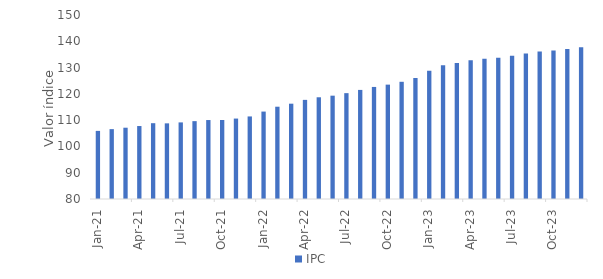
| Category | IPC |
|---|---|
| 2021-01-01 | 105.91 |
| 2021-02-01 | 106.58 |
| 2021-03-01 | 107.12 |
| 2021-04-01 | 107.76 |
| 2021-05-01 | 108.84 |
| 2021-06-01 | 108.78 |
| 2021-07-01 | 109.14 |
| 2021-08-01 | 109.62 |
| 2021-09-01 | 110.04 |
| 2021-10-01 | 110.06 |
| 2021-11-01 | 110.6 |
| 2021-12-01 | 111.41 |
| 2022-01-01 | 113.26 |
| 2022-02-01 | 115.11 |
| 2022-03-01 | 116.26 |
| 2022-04-01 | 117.71 |
| 2022-05-01 | 118.7 |
| 2022-06-01 | 119.31 |
| 2022-07-01 | 120.27 |
| 2022-08-01 | 121.5 |
| 2022-09-01 | 122.63 |
| 2022-10-01 | 123.51 |
| 2022-11-01 | 124.59 |
| 2022-12-01 | 126.03 |
| 2023-01-01 | 128.76 |
| 2023-02-01 | 130.87 |
| 2023-03-01 | 131.77 |
| 2023-04-01 | 132.8 |
| 2023-05-01 | 133.38 |
| 2023-06-01 | 133.78 |
| 2023-07-01 | 134.45 |
| 2023-08-01 | 135.39 |
| 2023-09-01 | 136.11 |
| 2023-10-01 | 136.45 |
| 2023-11-01 | 137.09 |
| 2023-12-01 | 137.72 |